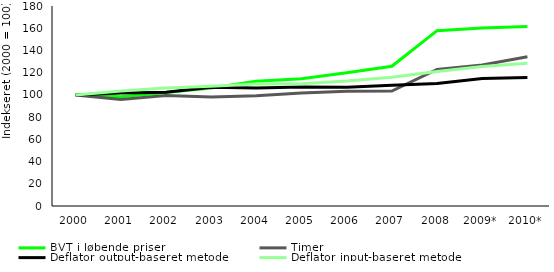
| Category | BVT i løbende priser | Timer | Deflator output-baseret metode | Deflator input-baseret metode |
|---|---|---|---|---|
| 2000 | 100 | 100 | 100 | 100 |
| 2001 | 98.295 | 95.836 | 101.773 | 103.405 |
| 2002 | 102.077 | 99.465 | 102.382 | 106.278 |
| 2003 | 106.238 | 98.13 | 106.811 | 107.883 |
| 2004 | 112.319 | 99.208 | 106.295 | 109.689 |
| 2005 | 114.432 | 101.593 | 107.145 | 109.981 |
| 2006 | 119.974 | 103.218 | 106.79 | 112.413 |
| 2007 | 125.744 | 103.387 | 108.626 | 115.879 |
| 2008 | 157.786 | 122.944 | 110.255 | 121.093 |
| 2009* | 160.215 | 126.836 | 114.755 | 125.486 |
| 2010* | 161.442 | 134.37 | 115.725 | 128.52 |